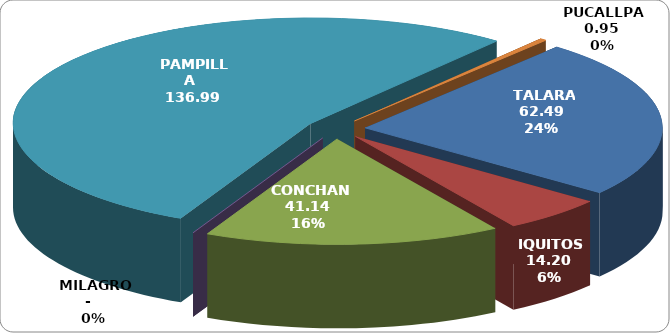
| Category | Series 0 |
|---|---|
| TALARA | 62.494 |
| IQUITOS | 14.196 |
| CONCHAN | 41.136 |
| MILAGRO | 0 |
| PAMPILLA | 136.991 |
| PUCALLPA | 0.954 |